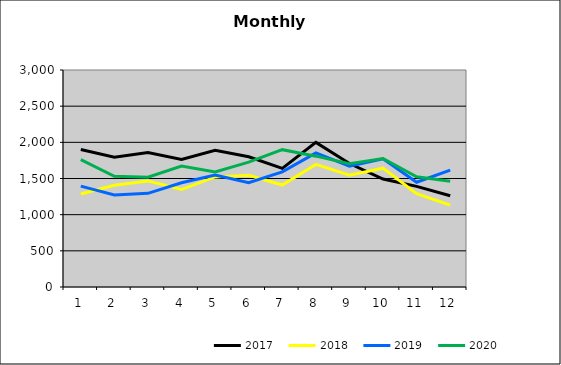
| Category | 2017 | 2018 | 2019 | 2020 |
|---|---|---|---|---|
| 0 | 1900.859 | 1286.21 | 1394.576 | 1762.064 |
| 1 | 1795.105 | 1406.556 | 1272.617 | 1530.829 |
| 2 | 1859.386 | 1466.695 | 1295.231 | 1518.163 |
| 3 | 1764.013 | 1347.408 | 1441.267 | 1671.58 |
| 4 | 1891.399 | 1522.181 | 1548.691 | 1589.128 |
| 5 | 1800.236 | 1543.945 | 1443.46 | 1725.706 |
| 6 | 1640.121 | 1409.491 | 1591.615 | 1898.774 |
| 7 | 1999.331 | 1694.901 | 1854.799 | 1808.872 |
| 8 | 1706.874 | 1545.104 | 1671.028 | 1702.742 |
| 9 | 1492.036 | 1642.816 | 1771.378 | 1776.573 |
| 10 | 1390.86 | 1288.934 | 1448.517 | 1524.82 |
| 11 | 1261.902 | 1131.485 | 1616.657 | 1460.857 |